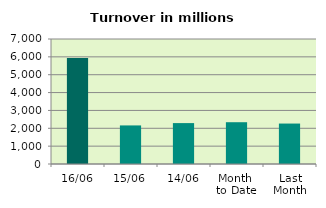
| Category | Series 0 |
|---|---|
| 16/06 | 5935.752 |
| 15/06 | 2160.29 |
| 14/06 | 2290.911 |
| Month 
to Date | 2339.936 |
| Last
Month | 2265.206 |